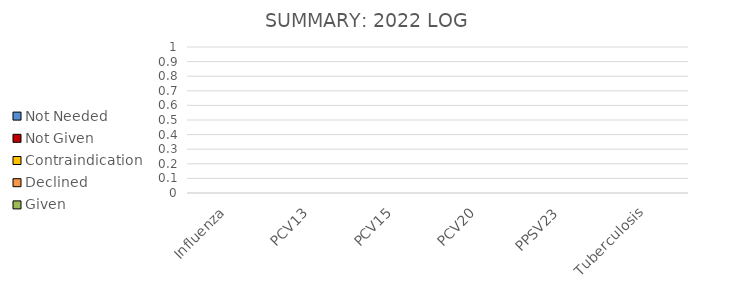
| Category | Given | Declined | Contraindication | Not Given | Not Needed |
|---|---|---|---|---|---|
| Influenza | 0 | 0 | 0 | 0 | 0 |
| PCV13 | 0 | 0 | 0 | 0 | 0 |
| PCV15 | 0 | 0 | 0 | 0 | 0 |
| PCV20 | 0 | 0 | 0 | 0 | 0 |
| PPSV23 | 0 | 0 | 0 | 0 | 0 |
| Tuberculosis | 0 | 0 | 0 | 0 | 0 |